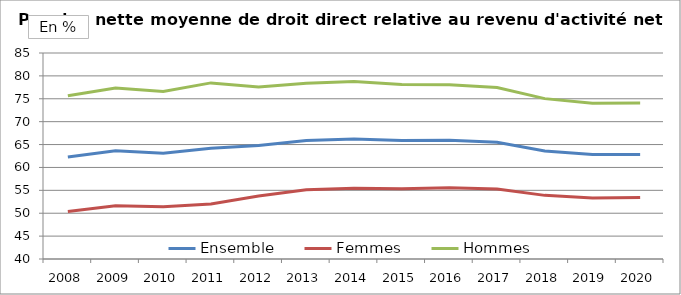
| Category | Ensemble | Femmes | Hommes |
|---|---|---|---|
| 2008.0 | 62.28 | 50.38 | 75.66 |
| 2009.0 | 63.65 | 51.61 | 77.36 |
| 2010.0 | 63.11 | 51.41 | 76.58 |
| 2011.0 | 64.19 | 52 | 78.47 |
| 2012.0 | 64.79 | 53.76 | 77.56 |
| 2013.0 | 65.89 | 55.12 | 78.41 |
| 2014.0 | 66.24 | 55.47 | 78.76 |
| 2015.0 | 65.87 | 55.32 | 78.14 |
| 2016.0 | 65.92 | 55.55 | 78.05 |
| 2017.0 | 65.51 | 55.29 | 77.47 |
| 2018.0 | 63.61 | 53.9 | 75.03 |
| 2019.0 | 62.81 | 53.3 | 74.04 |
| 2020.0 | 62.85 | 53.42 | 74.06 |